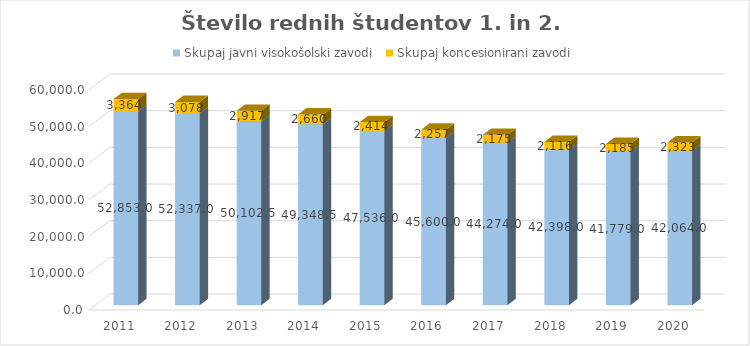
| Category | Skupaj javni visokošolski zavodi | Skupaj koncesionirani zavodi |
|---|---|---|
| 2011.0 | 52853 | 3364 |
| 2012.0 | 52337 | 3078 |
| 2013.0 | 50102.5 | 2917 |
| 2014.0 | 49348.5 | 2660 |
| 2015.0 | 47536 | 2414 |
| 2016.0 | 45600 | 2257 |
| 2017.0 | 44274 | 2175 |
| 2018.0 | 42398 | 2116 |
| 2019.0 | 41779 | 2185 |
| 2020.0 | 42064 | 2323 |